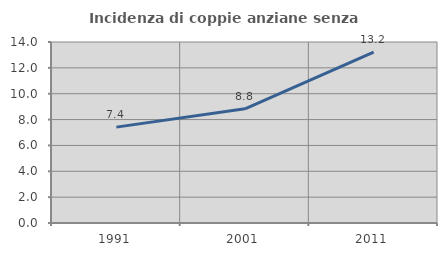
| Category | Incidenza di coppie anziane senza figli  |
|---|---|
| 1991.0 | 7.416 |
| 2001.0 | 8.832 |
| 2011.0 | 13.212 |